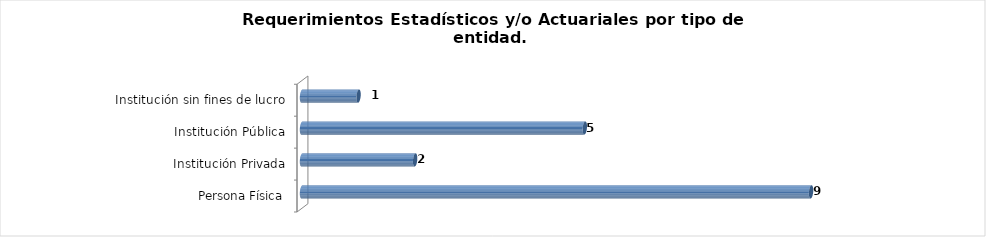
| Category | Total |
|---|---|
| Persona Física | 9 |
| Institución Privada | 2 |
| Institución Pública | 5 |
| Institución sin fines de lucro | 1 |